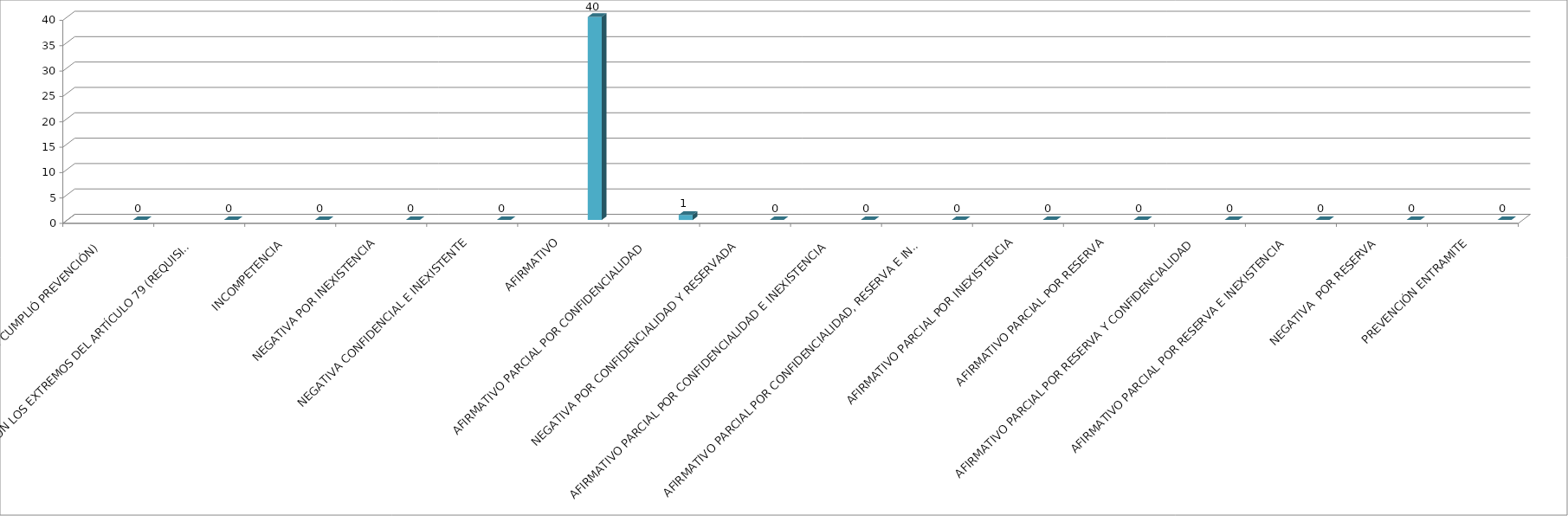
| Category | Series 0 | Series 1 | Series 2 | Series 3 | Series 4 |
|---|---|---|---|---|---|
| SE TIENE POR NO PRESENTADA ( NO CUMPLIÓ PREVENCIÓN) |  |  |  |  | 0 |
| NO CUMPLIO CON LOS EXTREMOS DEL ARTÍCULO 79 (REQUISITOS) |  |  |  |  | 0 |
| INCOMPETENCIA  |  |  |  |  | 0 |
| NEGATIVA POR INEXISTENCIA |  |  |  |  | 0 |
| NEGATIVA CONFIDENCIAL E INEXISTENTE |  |  |  |  | 0 |
| AFIRMATIVO |  |  |  |  | 40 |
| AFIRMATIVO PARCIAL POR CONFIDENCIALIDAD  |  |  |  |  | 1 |
| NEGATIVA POR CONFIDENCIALIDAD Y RESERVADA |  |  |  |  | 0 |
| AFIRMATIVO PARCIAL POR CONFIDENCIALIDAD E INEXISTENCIA |  |  |  |  | 0 |
| AFIRMATIVO PARCIAL POR CONFIDENCIALIDAD, RESERVA E INEXISTENCIA |  |  |  |  | 0 |
| AFIRMATIVO PARCIAL POR INEXISTENCIA |  |  |  |  | 0 |
| AFIRMATIVO PARCIAL POR RESERVA |  |  |  |  | 0 |
| AFIRMATIVO PARCIAL POR RESERVA Y CONFIDENCIALIDAD |  |  |  |  | 0 |
| AFIRMATIVO PARCIAL POR RESERVA E INEXISTENCIA |  |  |  |  | 0 |
| NEGATIVA  POR RESERVA |  |  |  |  | 0 |
| PREVENCIÓN ENTRAMITE |  |  |  |  | 0 |